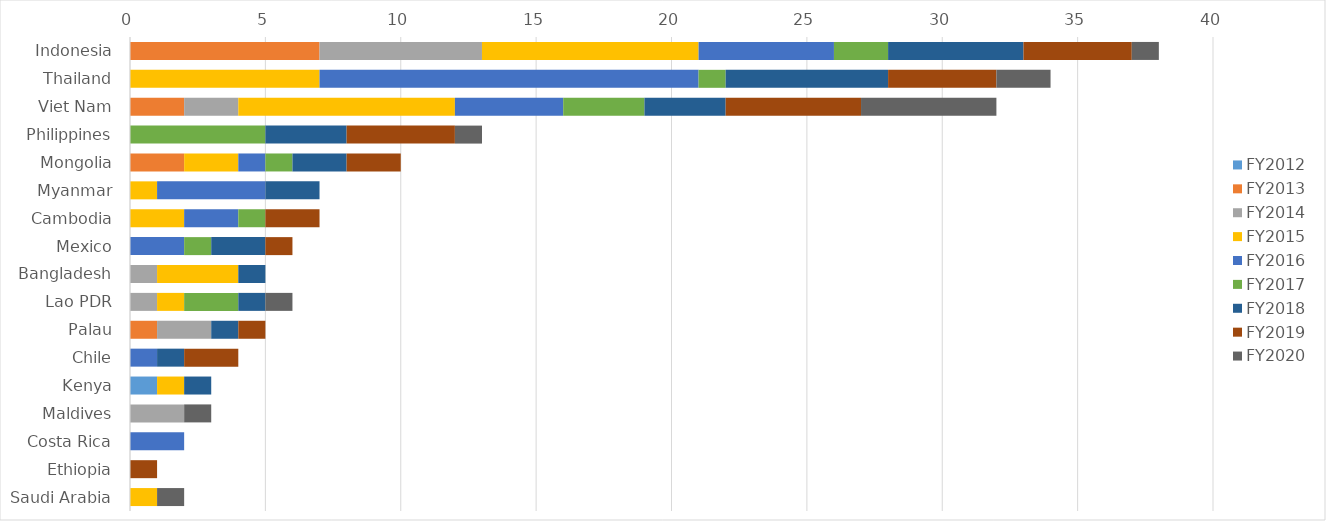
| Category | FY2012 | FY2013 | FY2014 | FY2015 | FY2016 | FY2017 | FY2018 | FY2019 | FY2020 |
|---|---|---|---|---|---|---|---|---|---|
| Indonesia | 0 | 7 | 6 | 8 | 5 | 2 | 5 | 4 | 1 |
| Thailand | 0 | 0 | 0 | 7 | 14 | 1 | 6 | 4 | 2 |
| Viet Nam | 0 | 2 | 2 | 8 | 4 | 3 | 3 | 5 | 5 |
| Philippines | 0 | 0 | 0 | 0 | 0 | 5 | 3 | 4 | 1 |
| Mongolia | 0 | 2 | 0 | 2 | 1 | 1 | 2 | 2 | 0 |
| Myanmar | 0 | 0 | 0 | 1 | 4 | 0 | 2 | 0 | 0 |
| Cambodia | 0 | 0 | 0 | 2 | 2 | 1 | 0 | 2 | 0 |
| Mexico | 0 | 0 | 0 | 0 | 2 | 1 | 2 | 1 | 0 |
| Bangladesh | 0 | 0 | 1 | 3 | 0 | 0 | 1 | 0 | 0 |
| Lao PDR | 0 | 0 | 1 | 1 | 0 | 2 | 1 | 0 | 1 |
| Palau | 0 | 1 | 2 | 0 | 0 | 0 | 1 | 1 | 0 |
| Chile | 0 | 0 | 0 | 0 | 1 | 0 | 1 | 2 | 0 |
| Kenya | 1 | 0 | 0 | 1 | 0 | 0 | 1 | 0 | 0 |
| Maldives | 0 | 0 | 2 | 0 | 0 | 0 | 0 | 0 | 1 |
| Costa Rica | 0 | 0 | 0 | 0 | 2 | 0 | 0 | 0 | 0 |
| Ethiopia | 0 | 0 | 0 | 0 | 0 | 0 | 0 | 1 | 0 |
| Saudi Arabia | 0 | 0 | 0 | 1 | 0 | 0 | 0 | 0 | 1 |